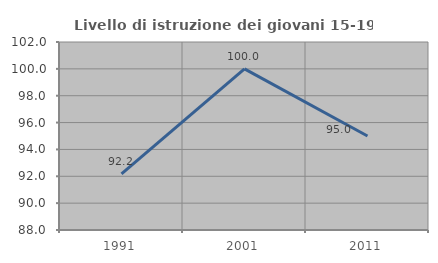
| Category | Livello di istruzione dei giovani 15-19 anni |
|---|---|
| 1991.0 | 92.174 |
| 2001.0 | 100 |
| 2011.0 | 95 |